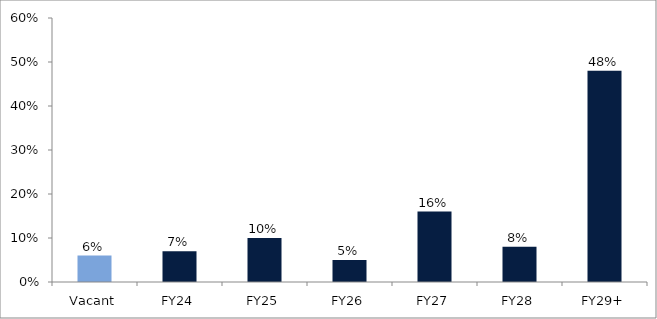
| Category | Series 0 |
|---|---|
| Vacant | 0.06 |
| FY24 | 0.07 |
| FY25 | 0.1 |
| FY26 | 0.05 |
| FY27 | 0.16 |
| FY28 | 0.08 |
| FY29+ | 0.48 |